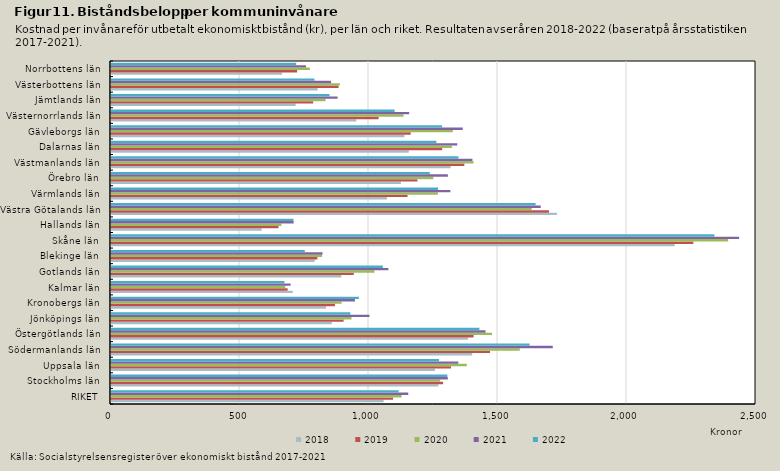
| Category | 2018 | 2019 | 2020 | 2021 | 2022 |
|---|---|---|---|---|---|
| RIKET | 1056.434 | 1093.041 | 1126.382 | 1152.152 | 1115.176 |
| Stockholms län | 1268.993 | 1287.17 | 1275.923 | 1305.465 | 1303.518 |
| Uppsala län | 1255.723 | 1317.84 | 1379.119 | 1346.149 | 1271.468 |
| Södermanlands län | 1400.05 | 1469.029 | 1584.483 | 1712.385 | 1622.581 |
| Östergötlands län | 1383.5 | 1405.319 | 1476.704 | 1451.732 | 1427.947 |
| Jönköpings län | 855.805 | 901.591 | 931.995 | 1001.766 | 927.73 |
| Kronobergs län | 833.544 | 868.004 | 893.994 | 945.588 | 960.61 |
| Kalmar län | 704.407 | 684.54 | 675.381 | 696.04 | 672.409 |
| Gotlands län | 892.617 | 941.215 | 1021.002 | 1074.974 | 1053.781 |
| Blekinge län | 789.401 | 800.026 | 817.986 | 819.74 | 751.097 |
| Skåne län | 2184.828 | 2257.164 | 2392.011 | 2434.589 | 2338.682 |
| Hallands län | 583.746 | 649.352 | 660.478 | 707.818 | 707.261 |
| Västra Götalands län | 1728.282 | 1697.827 | 1630.607 | 1665.682 | 1645.693 |
| Värmlands län | 1069.307 | 1149.338 | 1267.05 | 1315.505 | 1267.81 |
| Örebro län | 1123.596 | 1187.821 | 1249.276 | 1305.772 | 1235.728 |
| Västmanlands län | 1316.429 | 1369.567 | 1405.492 | 1400.96 | 1346.778 |
| Dalarnas län | 1154.19 | 1283.573 | 1321.279 | 1341.986 | 1260.906 |
| Gävleborgs län | 1137.533 | 1161.661 | 1324.81 | 1363.352 | 1283.325 |
| Västernorrlands län | 950.995 | 1037.248 | 1133.619 | 1155.749 | 1099.306 |
| Jämtlands län | 715.666 | 783.626 | 831.585 | 878.223 | 846.9 |
| Västerbottens län | 801.222 | 882.031 | 887.107 | 852.958 | 788.538 |
| Norrbottens län | 662.512 | 721.415 | 770.578 | 756.012 | 717.832 |